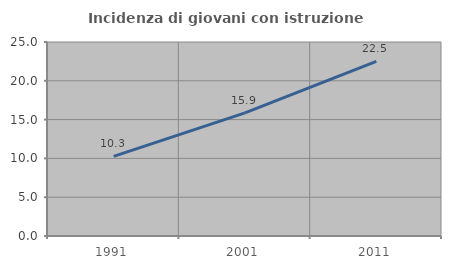
| Category | Incidenza di giovani con istruzione universitaria |
|---|---|
| 1991.0 | 10.252 |
| 2001.0 | 15.864 |
| 2011.0 | 22.505 |